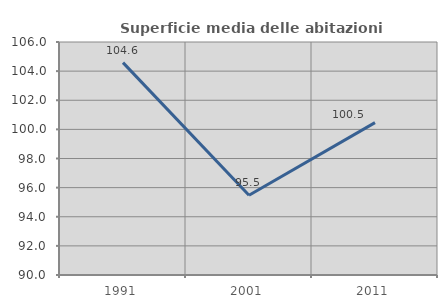
| Category | Superficie media delle abitazioni occupate |
|---|---|
| 1991.0 | 104.582 |
| 2001.0 | 95.473 |
| 2011.0 | 100.466 |